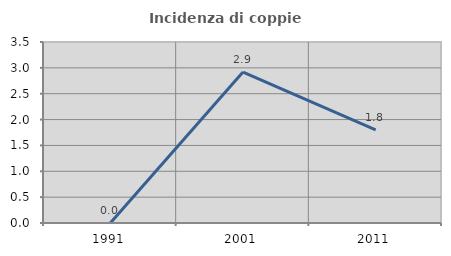
| Category | Incidenza di coppie miste |
|---|---|
| 1991.0 | 0 |
| 2001.0 | 2.92 |
| 2011.0 | 1.802 |